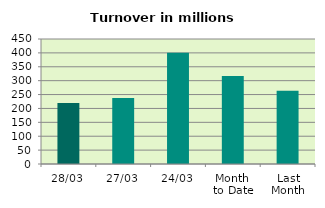
| Category | Series 0 |
|---|---|
| 28/03 | 219.478 |
| 27/03 | 237.802 |
| 24/03 | 400.944 |
| Month 
to Date | 317.112 |
| Last
Month | 263.32 |